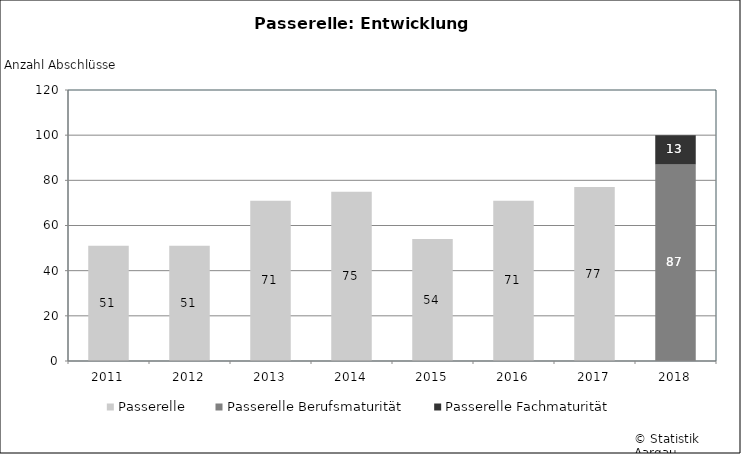
| Category | Passerelle | Passerelle Berufsmaturität | Passerelle Fachmaturität |
|---|---|---|---|
| 2011.0 | 51 | 0 | 0 |
| 2012.0 | 51 | 0 | 0 |
| 2013.0 | 71 | 0 | 0 |
| 2014.0 | 75 | 0 | 0 |
| 2015.0 | 54 | 0 | 0 |
| 2016.0 | 71 | 0 | 0 |
| 2017.0 | 77 | 0 | 0 |
| 2018.0 | 0 | 87 | 13 |